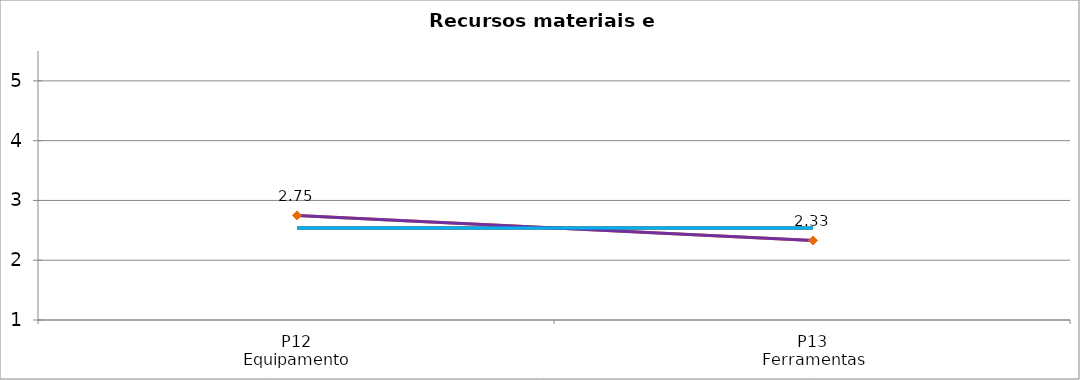
| Category | Valoración (1-5) | MEDIA |
|---|---|---|
| P12
Equipamento | 2.75 | 2.54 |
| P13
Ferramentas | 2.33 | 2.54 |